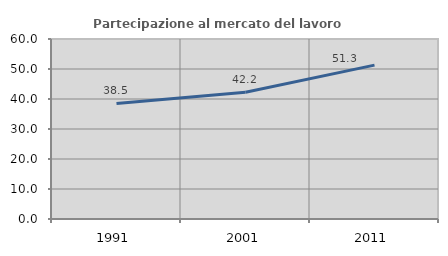
| Category | Partecipazione al mercato del lavoro  femminile |
|---|---|
| 1991.0 | 38.502 |
| 2001.0 | 42.222 |
| 2011.0 | 51.299 |